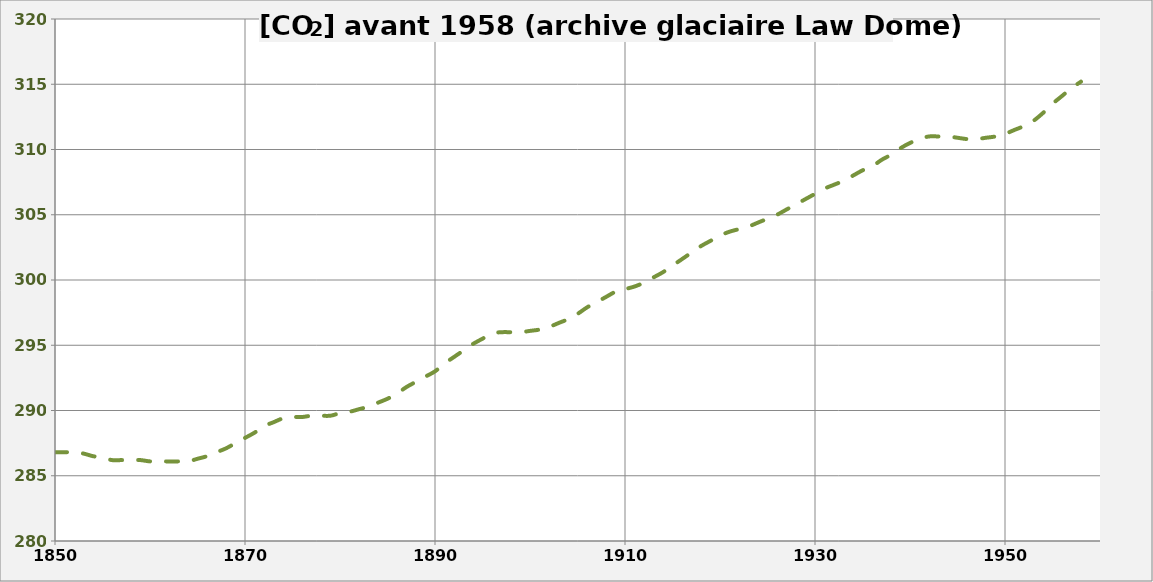
| Category | Series 0 |
|---|---|
| 1850.0 | 286.8 |
| 1851.0 | 286.8 |
| 1852.0 | 286.8 |
| 1853.0 | 286.7 |
| 1854.0 | 286.5 |
| 1855.0 | 286.4 |
| 1856.0 | 286.2 |
| 1857.0 | 286.2 |
| 1858.0 | 286.2 |
| 1859.0 | 286.2 |
| 1860.0 | 286.1 |
| 1861.0 | 286.1 |
| 1862.0 | 286.1 |
| 1863.0 | 286.1 |
| 1864.0 | 286.1 |
| 1865.0 | 286.3 |
| 1866.0 | 286.5 |
| 1867.0 | 286.8 |
| 1868.0 | 287.1 |
| 1869.0 | 287.5 |
| 1870.0 | 287.9 |
| 1871.0 | 288.3 |
| 1872.0 | 288.8 |
| 1873.0 | 289.1 |
| 1874.0 | 289.4 |
| 1875.0 | 289.5 |
| 1876.0 | 289.5 |
| 1877.0 | 289.6 |
| 1878.0 | 289.6 |
| 1879.0 | 289.6 |
| 1880.0 | 289.8 |
| 1881.0 | 289.9 |
| 1882.0 | 290.1 |
| 1883.0 | 290.3 |
| 1884.0 | 290.6 |
| 1885.0 | 290.9 |
| 1886.0 | 291.3 |
| 1887.0 | 291.8 |
| 1888.0 | 292.2 |
| 1889.0 | 292.6 |
| 1890.0 | 293 |
| 1891.0 | 293.6 |
| 1892.0 | 294.1 |
| 1893.0 | 294.6 |
| 1894.0 | 295.1 |
| 1895.0 | 295.5 |
| 1896.0 | 295.9 |
| 1897.0 | 296 |
| 1898.0 | 296 |
| 1899.0 | 296 |
| 1900.0 | 296.1 |
| 1901.0 | 296.2 |
| 1902.0 | 296.4 |
| 1903.0 | 296.7 |
| 1904.0 | 297 |
| 1905.0 | 297.4 |
| 1906.0 | 297.9 |
| 1907.0 | 298.3 |
| 1908.0 | 298.7 |
| 1909.0 | 299.1 |
| 1910.0 | 299.3 |
| 1911.0 | 299.5 |
| 1912.0 | 299.8 |
| 1913.0 | 300.2 |
| 1914.0 | 300.6 |
| 1915.0 | 301.1 |
| 1916.0 | 301.6 |
| 1917.0 | 302.1 |
| 1918.0 | 302.6 |
| 1919.0 | 303 |
| 1920.0 | 303.4 |
| 1921.0 | 303.7 |
| 1922.0 | 303.9 |
| 1923.0 | 304.1 |
| 1924.0 | 304.4 |
| 1925.0 | 304.7 |
| 1926.0 | 305 |
| 1927.0 | 305.4 |
| 1928.0 | 305.8 |
| 1929.0 | 306.2 |
| 1930.0 | 306.6 |
| 1931.0 | 307 |
| 1932.0 | 307.3 |
| 1933.0 | 307.6 |
| 1934.0 | 308 |
| 1935.0 | 308.4 |
| 1936.0 | 308.7 |
| 1937.0 | 309.2 |
| 1938.0 | 309.6 |
| 1939.0 | 310.1 |
| 1940.0 | 310.5 |
| 1941.0 | 310.8 |
| 1942.0 | 311 |
| 1943.0 | 311 |
| 1944.0 | 311 |
| 1945.0 | 310.9 |
| 1946.0 | 310.8 |
| 1947.0 | 310.8 |
| 1948.0 | 310.9 |
| 1949.0 | 311 |
| 1950.0 | 311.2 |
| 1951.0 | 311.5 |
| 1952.0 | 311.8 |
| 1953.0 | 312.2 |
| 1954.0 | 312.8 |
| 1955.0 | 313.5 |
| 1956.0 | 314.1 |
| 1957.0 | 314.7 |
| 1958.0 | 315.2 |